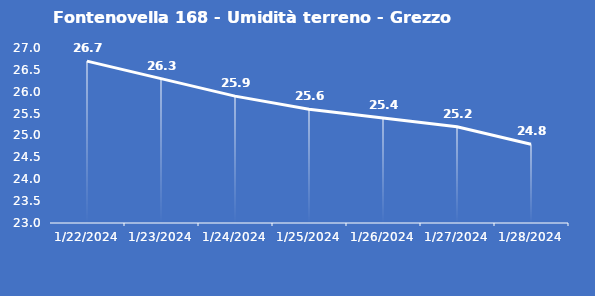
| Category | Fontenovella 168 - Umidità terreno - Grezzo (%VWC) |
|---|---|
| 1/22/24 | 26.7 |
| 1/23/24 | 26.3 |
| 1/24/24 | 25.9 |
| 1/25/24 | 25.6 |
| 1/26/24 | 25.4 |
| 1/27/24 | 25.2 |
| 1/28/24 | 24.8 |